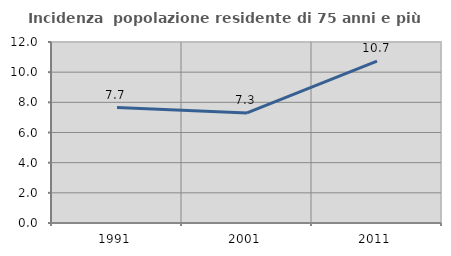
| Category | Incidenza  popolazione residente di 75 anni e più |
|---|---|
| 1991.0 | 7.655 |
| 2001.0 | 7.297 |
| 2011.0 | 10.739 |